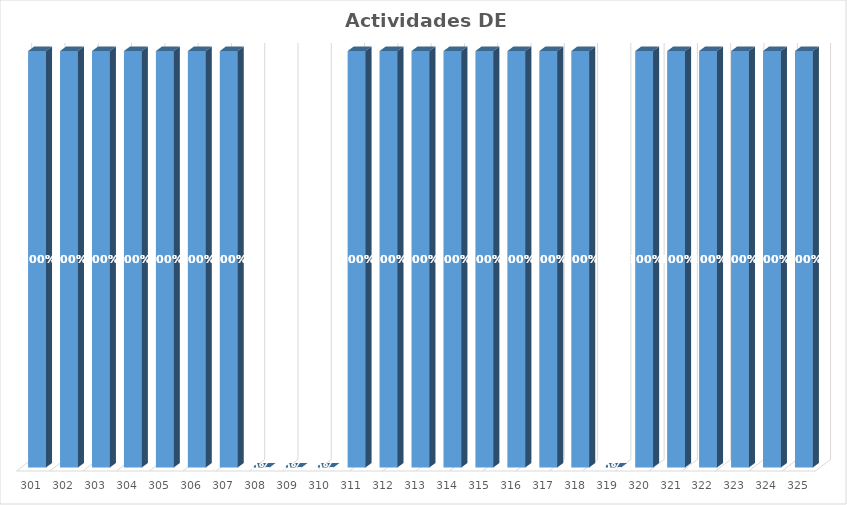
| Category | % Avance |
|---|---|
| 301.0 | 1 |
| 302.0 | 1 |
| 303.0 | 1 |
| 304.0 | 1 |
| 305.0 | 1 |
| 306.0 | 1 |
| 307.0 | 1 |
| 308.0 | 0 |
| 309.0 | 0 |
| 310.0 | 0 |
| 311.0 | 1 |
| 312.0 | 1 |
| 313.0 | 1 |
| 314.0 | 1 |
| 315.0 | 1 |
| 316.0 | 1 |
| 317.0 | 1 |
| 318.0 | 1 |
| 319.0 | 0 |
| 320.0 | 1 |
| 321.0 | 1 |
| 322.0 | 1 |
| 323.0 | 1 |
| 324.0 | 1 |
| 325.0 | 1 |